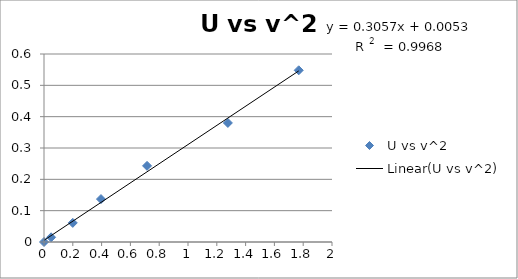
| Category | U vs v^2 |
|---|---|
| 0.0 | 0 |
| 0.049284 | 0.015 |
| 0.19980900000000001 | 0.061 |
| 0.395641 | 0.137 |
| 0.7157159999999999 | 0.243 |
| 1.2768999999999997 | 0.38 |
| 1.7689000000000001 | 0.548 |